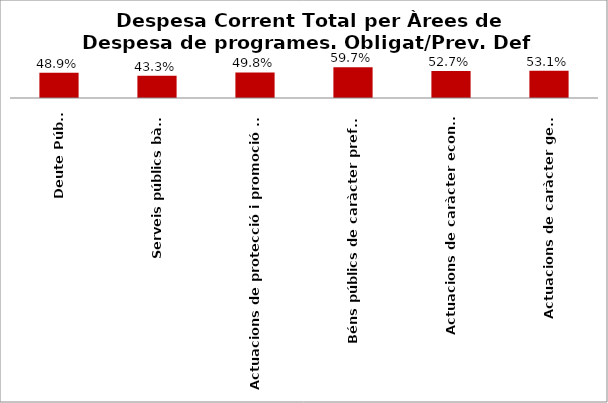
| Category | Series 0 |
|---|---|
| Deute Públic | 0.489 |
| Serveis públics bàsics | 0.433 |
| Actuacions de protecció i promoció social | 0.498 |
| Béns públics de caràcter preferent | 0.597 |
| Actuacions de caràcter econòmic | 0.527 |
| Actuacions de caràcter general | 0.531 |